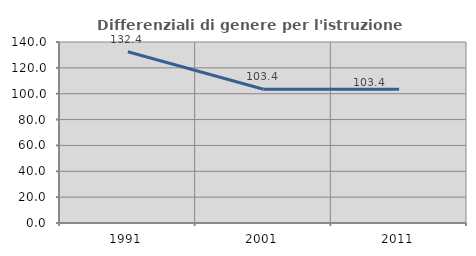
| Category | Differenziali di genere per l'istruzione superiore |
|---|---|
| 1991.0 | 132.419 |
| 2001.0 | 103.42 |
| 2011.0 | 103.437 |